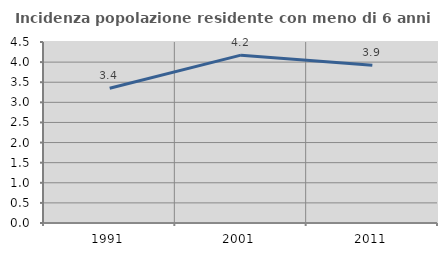
| Category | Incidenza popolazione residente con meno di 6 anni |
|---|---|
| 1991.0 | 3.351 |
| 2001.0 | 4.173 |
| 2011.0 | 3.922 |